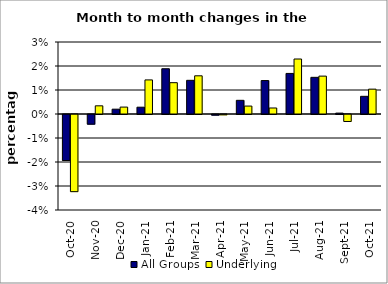
| Category | All Groups | Underlying |
|---|---|---|
| 2020-10-01 | -0.019 | -0.032 |
| 2020-11-01 | -0.004 | 0.003 |
| 2020-12-01 | 0.002 | 0.003 |
| 2021-01-01 | 0.003 | 0.014 |
| 2021-02-01 | 0.019 | 0.013 |
| 2021-03-01 | 0.014 | 0.016 |
| 2021-04-01 | 0 | 0 |
| 2021-05-01 | 0.006 | 0.003 |
| 2021-06-01 | 0.014 | 0.003 |
| 2021-07-01 | 0.017 | 0.023 |
| 2021-08-01 | 0.015 | 0.016 |
| 2021-09-01 | 0 | -0.003 |
| 2021-10-01 | 0.007 | 0.01 |